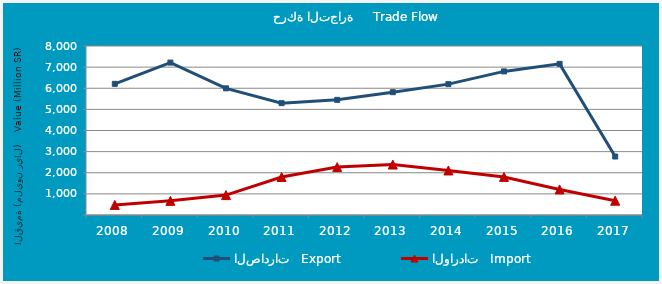
| Category | الصادرات   Export | الواردات   Import |
|---|---|---|
| 2008.0 | 6208690112 | 478319100 |
| 2009.0 | 7215510498 | 669060974 |
| 2010.0 | 5996048240 | 941941987 |
| 2011.0 | 5294044316 | 1797348885 |
| 2012.0 | 5451724578 | 2268417657 |
| 2013.0 | 5813058166 | 2388766661 |
| 2014.0 | 6195238619 | 2108541269 |
| 2015.0 | 6797586748 | 1802931285 |
| 2016.0 | 7154525775 | 1209209333 |
| 2017.0 | 2768195028 | 677007985 |